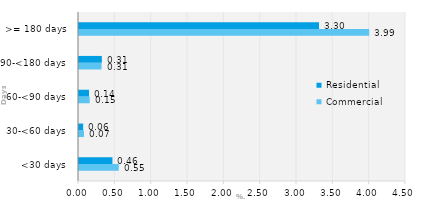
| Category | Commercial | Residential |
|---|---|---|
| <30 days | 0.547 | 0.46 |
| 30-<60 days | 0.068 | 0.057 |
| 60-<90 days | 0.147 | 0.138 |
| 90-<180 days | 0.31 | 0.314 |
| >= 180 days | 3.993 | 3.303 |